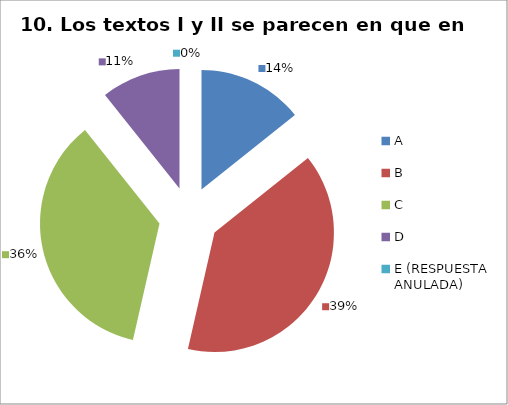
| Category | CANTIDAD DE RESPUESTAS PREGUNTA (10) | PORCENTAJE |
|---|---|---|
| A | 4 | 0.143 |
| B | 11 | 0.393 |
| C | 10 | 0.357 |
| D | 3 | 0.107 |
| E (RESPUESTA ANULADA) | 0 | 0 |